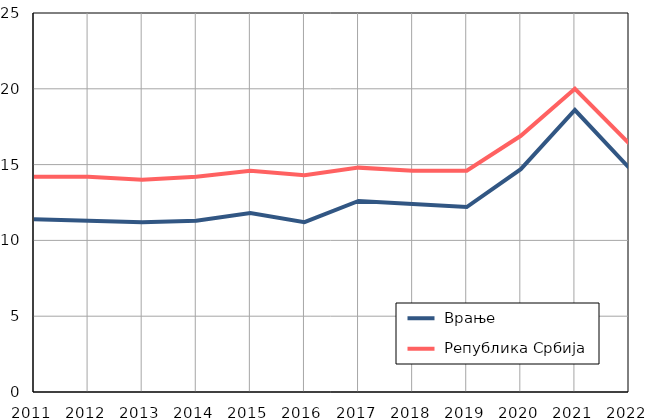
| Category |  Врање |  Република Србија |
|---|---|---|
| 2011.0 | 11.4 | 14.2 |
| 2012.0 | 11.3 | 14.2 |
| 2013.0 | 11.2 | 14 |
| 2014.0 | 11.3 | 14.2 |
| 2015.0 | 11.8 | 14.6 |
| 2016.0 | 11.2 | 14.3 |
| 2017.0 | 12.6 | 14.8 |
| 2018.0 | 12.4 | 14.6 |
| 2019.0 | 12.2 | 14.6 |
| 2020.0 | 14.7 | 16.9 |
| 2021.0 | 18.6 | 20 |
| 2022.0 | 14.8 | 16.4 |